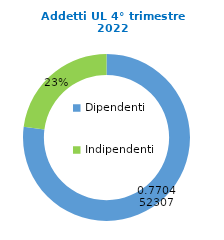
| Category | Series 0 |
|---|---|
| Dipendenti | 64916 |
| Indipendenti | 19341 |